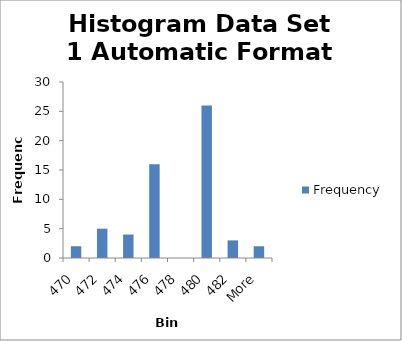
| Category | Frequency |
|---|---|
| 470 | 2 |
| 472 | 5 |
| 474 | 4 |
| 476 | 16 |
| 478 | 0 |
| 480 | 26 |
| 482 | 3 |
| More | 2 |